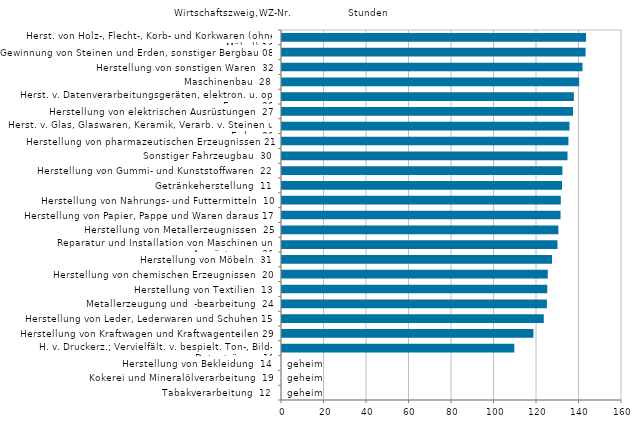
| Category | Series 0 |
|---|---|
| Herst. von Holz-, Flecht-, Korb- und Korkwaren (ohne Möbel) 16 | 143.065 |
| Gewinnung von Steinen und Erden, sonstiger Bergbau 08 | 142.853 |
| Herstellung von sonstigen Waren  32 | 141.413 |
| Maschinenbau  28 | 139.844 |
| Herst. v. Datenverarbeitungsgeräten, elektron. u. opt. Erzeug. 26 | 137.343 |
| Herstellung von elektrischen Ausrüstungen  27 | 136.939 |
| Herst. v. Glas, Glaswaren, Keramik, Verarb. v. Steinen u. Erden 23 | 135.28 |
| Herstellung von pharmazeutischen Erzeugnissen 21 | 134.785 |
| Sonstiger Fahrzeugbau  30 | 134.359 |
| Herstellung von Gummi- und Kunststoffwaren  22 | 131.961 |
| Getränkeherstellung  11 | 131.764 |
| Herstellung von Nahrungs- und Futtermitteln  10 | 131.194 |
| Herstellung von Papier, Pappe und Waren daraus 17 | 131.08 |
| Herstellung von Metallerzeugnissen  25 | 130.054 |
| Reparatur und Installation von Maschinen und Ausrüstungen 33 | 129.636 |
| Herstellung von Möbeln  31 | 127.08 |
| Herstellung von chemischen Erzeugnissen  20 | 125.059 |
| Herstellung von Textilien  13 | 124.835 |
| Metallerzeugung und  -bearbeitung  24 | 124.649 |
| Herstellung von Leder, Lederwaren und Schuhen 15 | 123.192 |
| Herstellung von Kraftwagen und Kraftwagenteilen 29 | 118.336 |
| H. v. Druckerz.; Vervielfält. v. bespielt. Ton-, Bild-, Datenträgern 18 | 109.315 |
| Herstellung von Bekleidung  14 | 0 |
| Kokerei und Mineralölverarbeitung  19 | 0 |
| Tabakverarbeitung  12 | 0 |